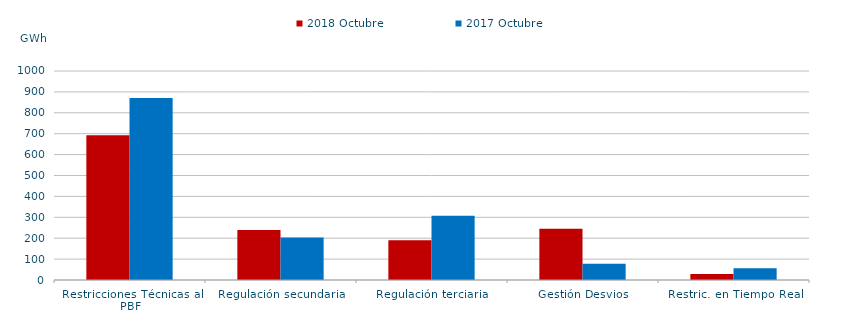
| Category | 2018 Octubre | 2017 Octubre |
|---|---|---|
| Restricciones Técnicas al PBF | 692.083 | 870.368 |
| Regulación secundaria | 239.146 | 203.218 |
| Regulación terciaria | 189.887 | 307.617 |
| Gestión Desvios | 245.372 | 78.316 |
| Restric. en Tiempo Real | 29.178 | 56.579 |